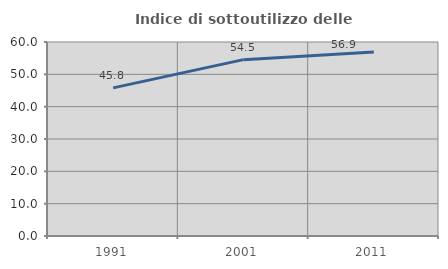
| Category | Indice di sottoutilizzo delle abitazioni  |
|---|---|
| 1991.0 | 45.81 |
| 2001.0 | 54.545 |
| 2011.0 | 56.915 |